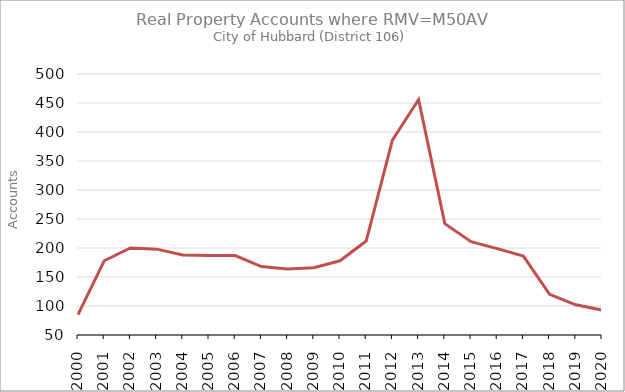
| Category | Series 0 |
|---|---|
| 2000.0 | 85 |
| 2001.0 | 178 |
| 2002.0 | 200 |
| 2003.0 | 198 |
| 2004.0 | 188 |
| 2005.0 | 187 |
| 2006.0 | 187 |
| 2007.0 | 168 |
| 2008.0 | 164 |
| 2009.0 | 166 |
| 2010.0 | 178 |
| 2011.0 | 212 |
| 2012.0 | 386 |
| 2013.0 | 456 |
| 2014.0 | 242 |
| 2015.0 | 211 |
| 2016.0 | 199 |
| 2017.0 | 186 |
| 2018.0 | 120 |
| 2019.0 | 102 |
| 2020.0 | 93 |